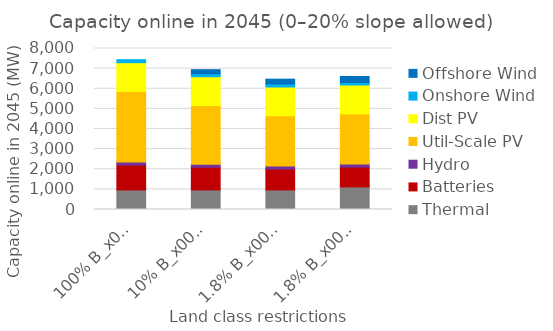
| Category | Thermal | Batteries | Hydro | Util-Scale PV | Dist PV | Onshore Wind | Offshore Wind |
|---|---|---|---|---|---|---|---|
| 100% B_x000d_100% C | 972.926 | 1235.44 | 150 | 3504.365 | 1432.455 | 150 | 0 |
| 10% B_x000d_10% C | 972.926 | 1124.953 | 150 | 2916.614 | 1432.455 | 150 | 200.62 |
| 1.8% B_x000d_1.1% C | 972.926 | 1034.751 | 150 | 2497.561 | 1432.455 | 150 | 237.137 |
| 1.8% B_x000d_1.1% C_x000d_no new wind | 1123.512 | 983.182 | 150 | 2498.166 | 1432.455 | 123 | 298.584 |